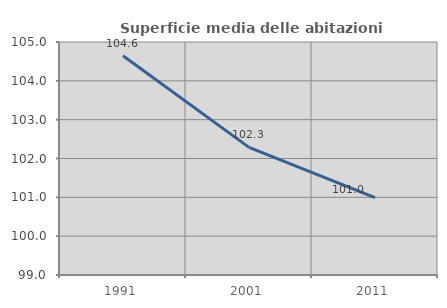
| Category | Superficie media delle abitazioni occupate |
|---|---|
| 1991.0 | 104.647 |
| 2001.0 | 102.287 |
| 2011.0 | 100.99 |